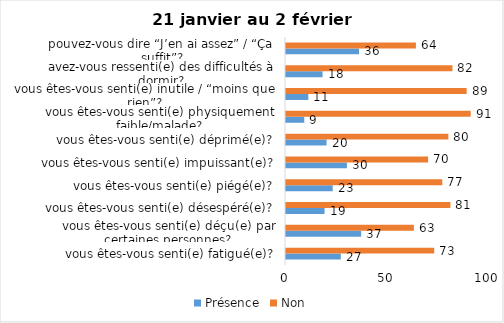
| Category | Présence | Non |
|---|---|---|
| vous êtes-vous senti(e) fatigué(e)? | 27 | 73 |
| vous êtes-vous senti(e) déçu(e) par certaines personnes? | 37 | 63 |
| vous êtes-vous senti(e) désespéré(e)? | 19 | 81 |
| vous êtes-vous senti(e) piégé(e)? | 23 | 77 |
| vous êtes-vous senti(e) impuissant(e)? | 30 | 70 |
| vous êtes-vous senti(e) déprimé(e)? | 20 | 80 |
| vous êtes-vous senti(e) physiquement faible/malade? | 9 | 91 |
| vous êtes-vous senti(e) inutile / “moins que rien”? | 11 | 89 |
| avez-vous ressenti(e) des difficultés à dormir? | 18 | 82 |
| pouvez-vous dire “J’en ai assez” / “Ça suffit”? | 36 | 64 |